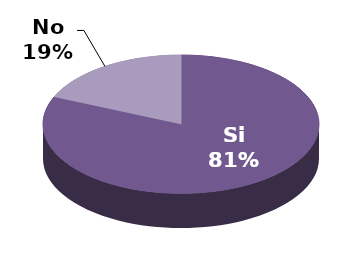
| Category | Series 1 |
|---|---|
| Si | 57 |
| No | 13 |